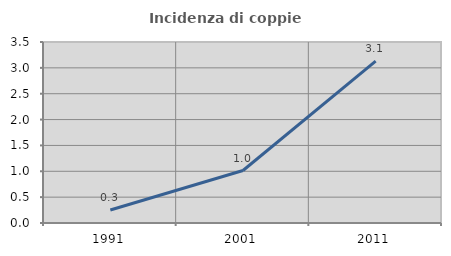
| Category | Incidenza di coppie miste |
|---|---|
| 1991.0 | 0.251 |
| 2001.0 | 1.015 |
| 2011.0 | 3.132 |